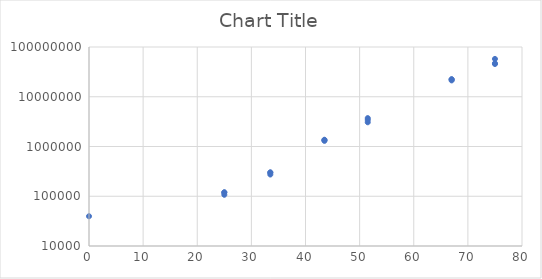
| Category | Series 0 |
|---|---|
| 0.0 | 39654.587 |
| 25.000000000000007 | 119306.341 |
| 25.000000000000007 | 107090.622 |
| 25.000000000000007 | 119913.383 |
| 33.5 | 273373.232 |
| 33.5 | 302680.311 |
| 33.5 | 298248.123 |
| 43.5 | 1297325.008 |
| 43.5 | 1367004.058 |
| 43.5 | 1344506.891 |
| 51.5 | 3068534.018 |
| 51.5 | 3422153.641 |
| 51.5 | 3722443.763 |
| 67.0 | 22309609.58 |
| 67.0 | 22499807.993 |
| 67.0 | 21321817.061 |
| 75.0 | 57585667.313 |
| 75.0 | 45520201.86 |
| 75.0 | 47066892.978 |